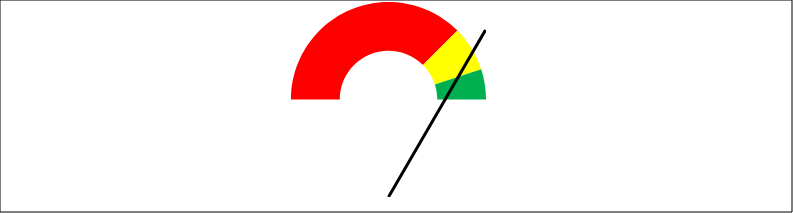
| Category | Series 0 |
|---|---|
| 0 | 0.75 |
| 1 | 0.15 |
| 2 | 0.1 |
| 3 | 1 |